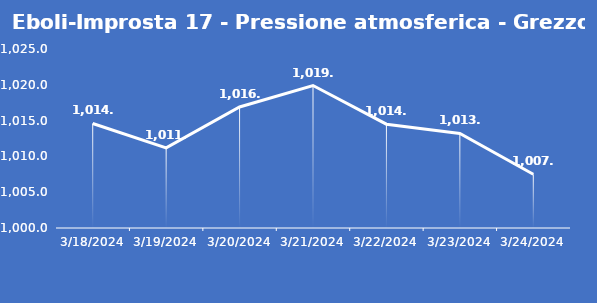
| Category | Eboli-Improsta 17 - Pressione atmosferica - Grezzo (hPa) |
|---|---|
| 3/18/24 | 1014.6 |
| 3/19/24 | 1011.2 |
| 3/20/24 | 1016.9 |
| 3/21/24 | 1019.9 |
| 3/22/24 | 1014.5 |
| 3/23/24 | 1013.2 |
| 3/24/24 | 1007.5 |